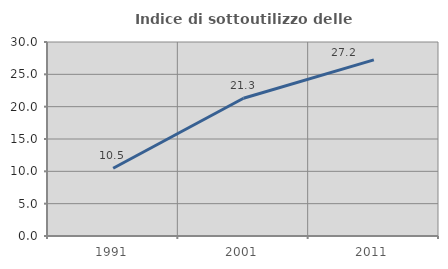
| Category | Indice di sottoutilizzo delle abitazioni  |
|---|---|
| 1991.0 | 10.476 |
| 2001.0 | 21.296 |
| 2011.0 | 27.227 |